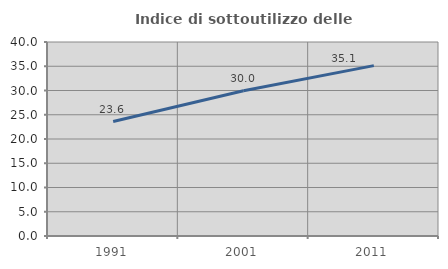
| Category | Indice di sottoutilizzo delle abitazioni  |
|---|---|
| 1991.0 | 23.605 |
| 2001.0 | 29.962 |
| 2011.0 | 35.133 |